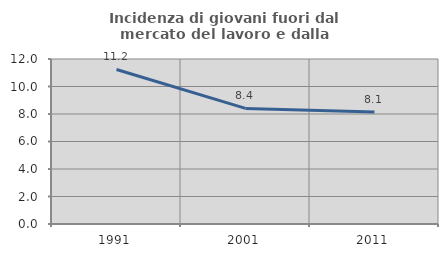
| Category | Incidenza di giovani fuori dal mercato del lavoro e dalla formazione  |
|---|---|
| 1991.0 | 11.239 |
| 2001.0 | 8.406 |
| 2011.0 | 8.145 |